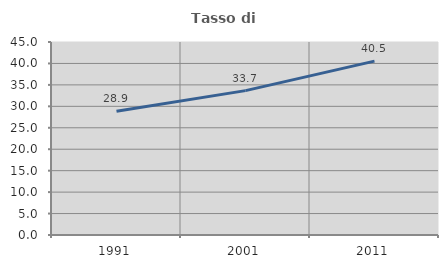
| Category | Tasso di occupazione   |
|---|---|
| 1991.0 | 28.86 |
| 2001.0 | 33.661 |
| 2011.0 | 40.543 |